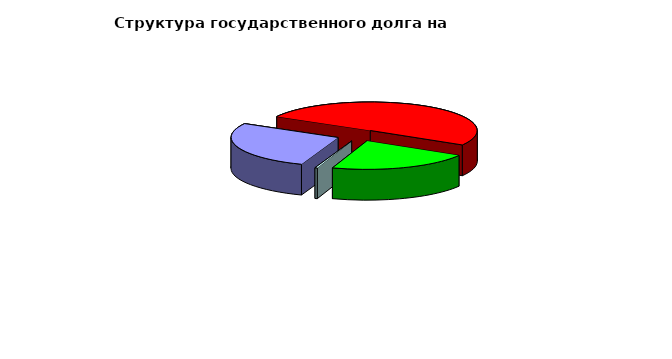
| Category | Series 0 |
|---|---|
| Договоры и соглашения о получении бюджетных кредитов от бюджетов других уровней бюджетной системы  | 20959084.963 |
| Государственные займы, осуществляемые путем выпуска ценных бумаг  | 38300000 |
| Кредитные соглашения и договоры | 16500000 |
| Договоры о предоставлении государственных гарантий | 267412.82 |